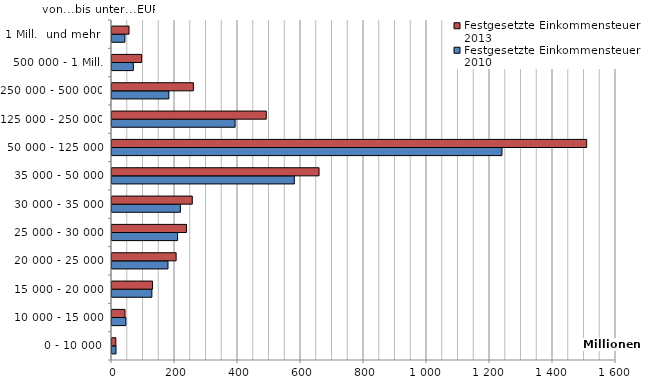
| Category | Festgesetzte Einkommensteuer 2010 | Festgesetzte Einkommensteuer 2013 |
|---|---|---|
| 0 - 10 000 | 12710 | 12122 |
| 10 000 - 15 000 | 43928 | 41275 |
| 15 000 - 20 000 | 126605 | 128548 |
| 20 000 - 25 000 | 177747 | 203615 |
| 25 000 - 30 000 | 208160 | 236413 |
| 30 000 - 35 000 | 217077 | 254875 |
| 35 000 - 50 000 | 578852 | 657326 |
| 50 000 - 125 000 | 1237979 | 1506894 |
| 125 000 - 250 000 | 390808 | 489785 |
| 250 000 - 500 000 | 180451 | 258377 |
| 500 000 - 1 Mill. | 67713 | 93986 |
| 1 Mill.  und mehr  | 40852 | 53947 |